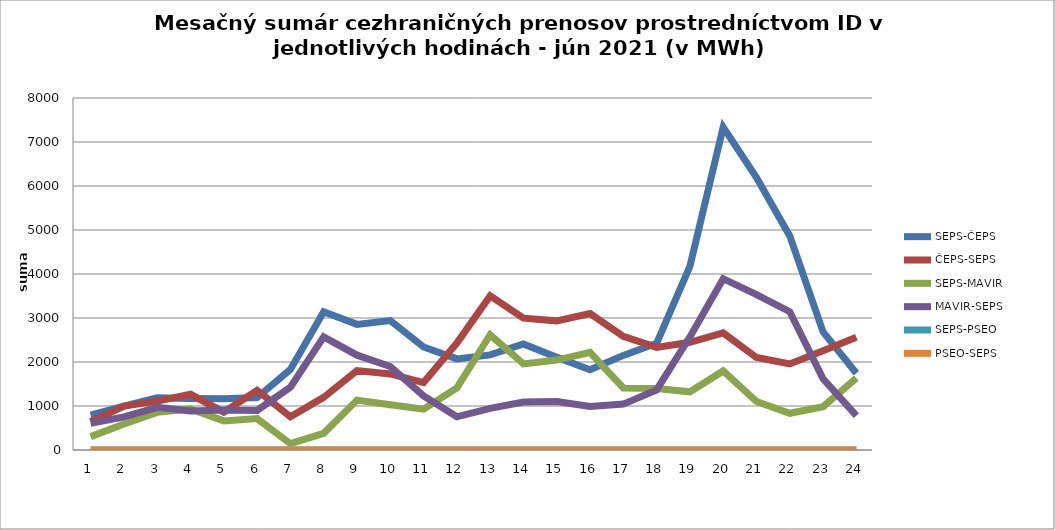
| Category | SEPS-ČEPS | ČEPS-SEPS | SEPS-MAVIR | MAVIR-SEPS | SEPS-PSEO | PSEO-SEPS |
|---|---|---|---|---|---|---|
| 1.0 | 794 | 642 | 304 | 604 | 0 | 0 |
| 2.0 | 998 | 998 | 592 | 752 | 0 | 0 |
| 3.0 | 1190 | 1110 | 856 | 969 | 0 | 0 |
| 4.0 | 1173 | 1266 | 932 | 887 | 0 | 0 |
| 5.0 | 1163 | 860 | 661 | 911 | 0 | 0 |
| 6.0 | 1192 | 1355 | 714 | 898 | 0 | 0 |
| 7.0 | 1832 | 756 | 143 | 1427 | 0 | 0 |
| 8.0 | 3140 | 1196 | 379 | 2572 | 0 | 0 |
| 9.0 | 2855 | 1806 | 1134 | 2155 | 0 | 0 |
| 10.0 | 2941 | 1729 | 1027 | 1897 | 0 | 0 |
| 11.0 | 2341 | 1533 | 928 | 1230 | 0 | 0 |
| 12.0 | 2071 | 2430 | 1411 | 754 | 0 | 0 |
| 13.0 | 2161 | 3502 | 2619 | 946 | 0 | 0 |
| 14.0 | 2411 | 2997 | 1956 | 1091 | 0 | 0 |
| 15.0 | 2108 | 2935 | 2044 | 1103 | 0 | 0 |
| 16.0 | 1822 | 3102 | 2217 | 990 | 0 | 0 |
| 17.0 | 2150 | 2582 | 1410 | 1043 | 0 | 0 |
| 18.0 | 2425 | 2333 | 1396 | 1366 | 0 | 0 |
| 19.0 | 4175 | 2448 | 1323 | 2571 | 0 | 0 |
| 20.0 | 7339 | 2662 | 1797 | 3893 | 0 | 0 |
| 21.0 | 6192 | 2101 | 1102 | 3531 | 0 | 0 |
| 22.0 | 4865 | 1957 | 835 | 3142 | 0 | 0 |
| 23.0 | 2684 | 2255 | 985 | 1619 | 0 | 0 |
| 24.0 | 1743 | 2563 | 1634 | 780 | 0 | 0 |